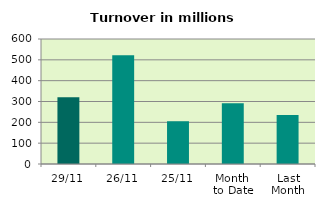
| Category | Series 0 |
|---|---|
| 29/11 | 320.684 |
| 26/11 | 522.053 |
| 25/11 | 205.422 |
| Month 
to Date | 292.134 |
| Last
Month | 235.36 |